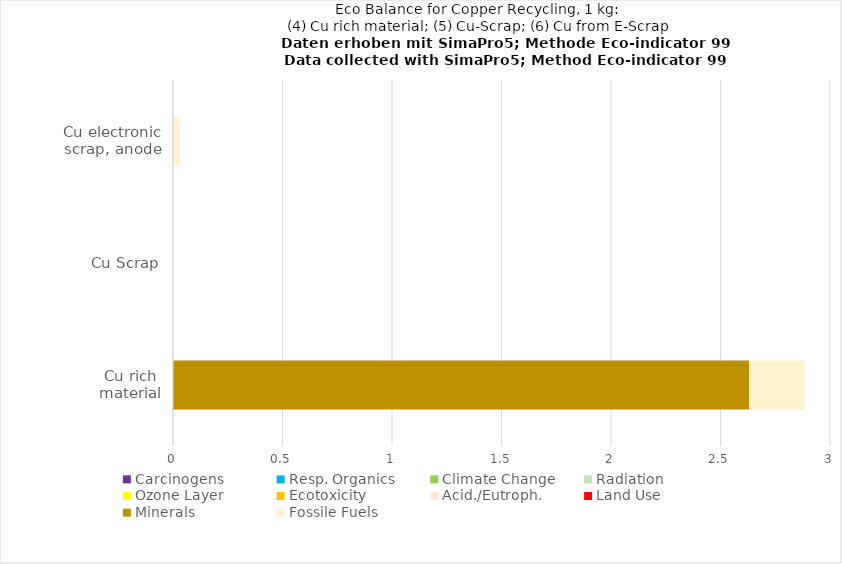
| Category | Carcinogens | Resp. Organics | Climate Change | Radiation | Ozone Layer | Ecotoxicity | Acid./Eutroph. | Land Use | Minerals | Fossile Fuels |
|---|---|---|---|---|---|---|---|---|---|---|
| Cu rich material | 0 | 0 | 0 | 0 | 0 | 0 | 0 | 0 | 2.63 | 0.254 |
| Cu Scrap | 0 | 0 | 0 | 0 | 0 | 0 | 0 | 0 | 0 | 0.001 |
| Cu electronic scrap, anode | 0 | 0 | 0 | 0 | 0 | 0 | 0 | 0 | 0.001 | 0.031 |